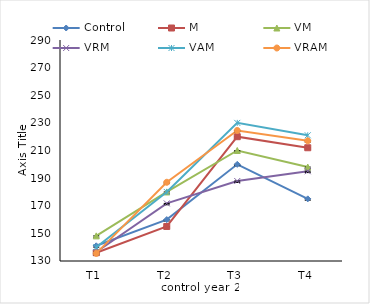
| Category | Control | M | VM | VRM | VAM | VRAM |
|---|---|---|---|---|---|---|
| T1 | 141 | 136 | 148.2 | 136.5 | 140 | 135.5 |
| T2 | 160 | 155 | 180 | 171.7 | 180 | 187 |
| T3 | 200 | 220 | 210 | 187.9 | 230 | 224.5 |
| T4 | 175 | 212 | 198 | 195 | 221 | 217 |